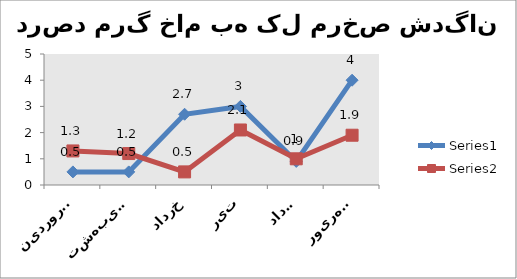
| Category | Series 0 | Series 1 |
|---|---|---|
| فروردین | 0.5 | 1.3 |
| اردیبهشت | 0.5 | 1.2 |
| خرداد | 2.7 | 0.5 |
| تیر | 3 | 2.1 |
| مرداد | 0.9 | 1 |
| شهریور | 4 | 1.9 |